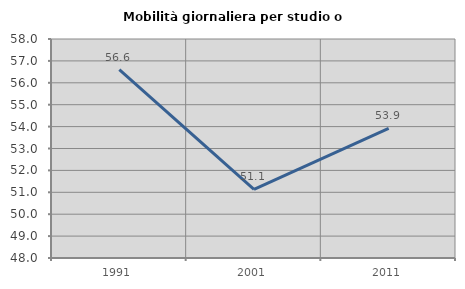
| Category | Mobilità giornaliera per studio o lavoro |
|---|---|
| 1991.0 | 56.597 |
| 2001.0 | 51.134 |
| 2011.0 | 53.919 |